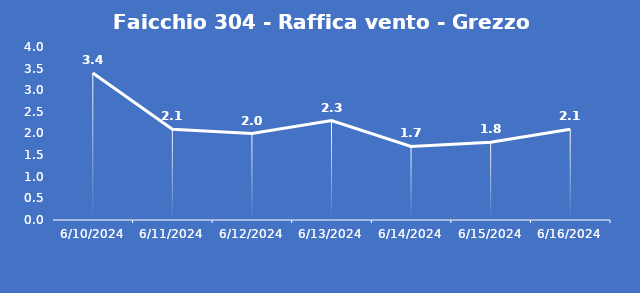
| Category | Faicchio 304 - Raffica vento - Grezzo (m/s) |
|---|---|
| 6/10/24 | 3.4 |
| 6/11/24 | 2.1 |
| 6/12/24 | 2 |
| 6/13/24 | 2.3 |
| 6/14/24 | 1.7 |
| 6/15/24 | 1.8 |
| 6/16/24 | 2.1 |